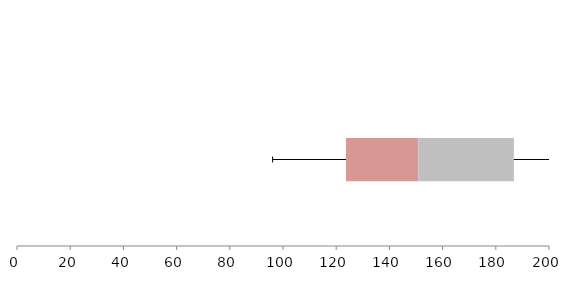
| Category | Series 1 | Series 2 | Series 3 |
|---|---|---|---|
| 0 | 123.68 | 27.21 | 35.898 |